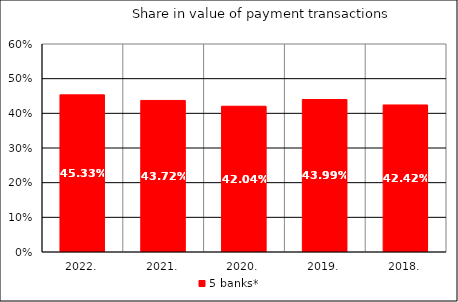
| Category | 5 banks* |
|---|---|
| 2022. | 0.453 |
| 2021. | 0.437 |
| 2020. | 0.42 |
| 2019. | 0.44 |
| 2018. | 0.424 |